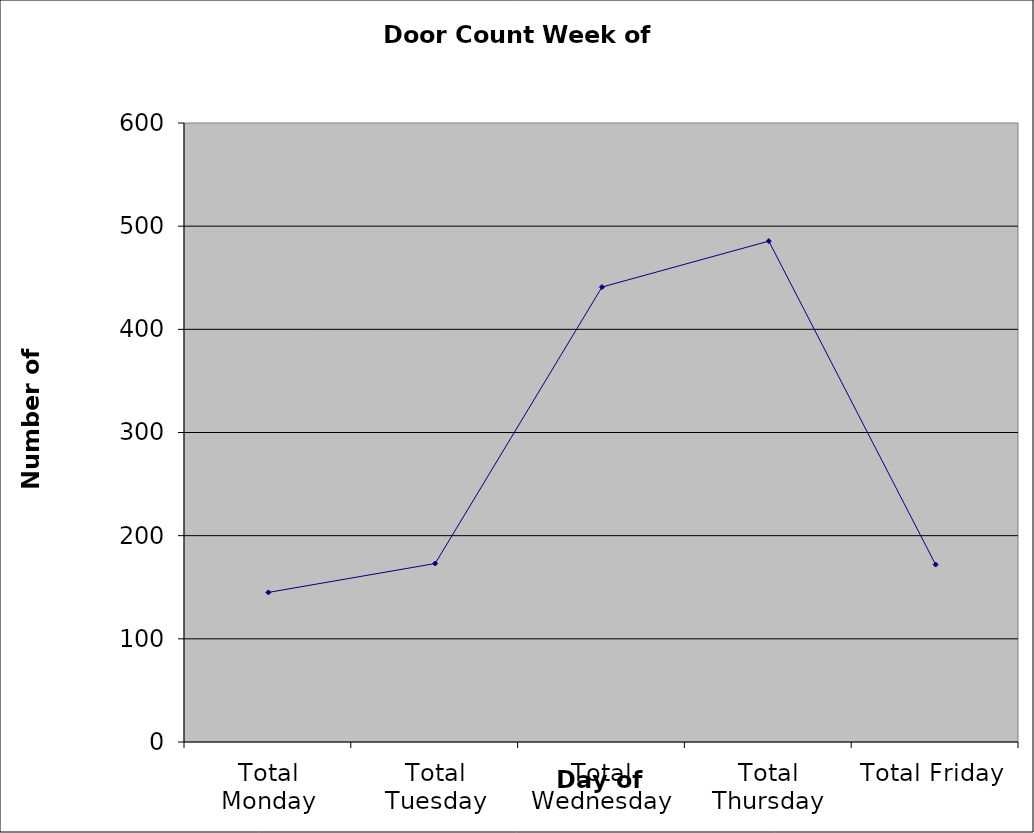
| Category | Series 0 |
|---|---|
| Total Monday | 145 |
| Total Tuesday | 173 |
| Total Wednesday | 441 |
| Total Thursday | 485.5 |
| Total Friday | 172 |